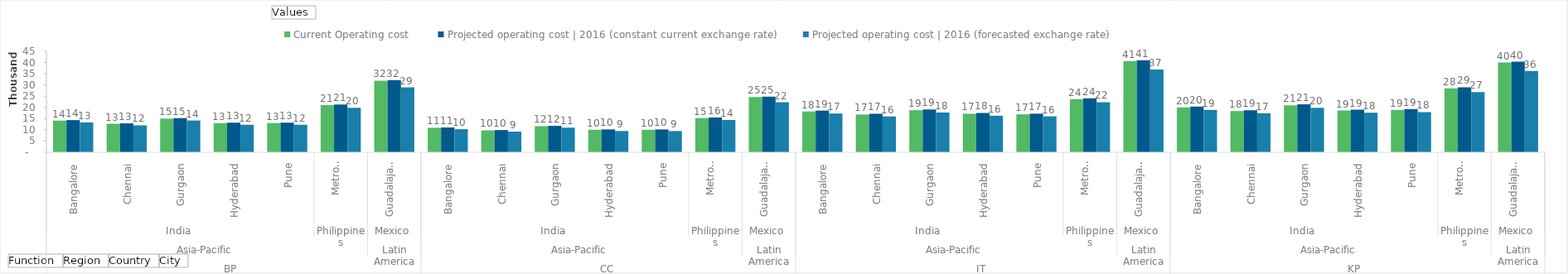
| Category | Current Operating cost  | Projected operating cost | 2016 (constant current exchange rate)  | Projected operating cost | 2016 (forecasted exchange rate)  |
|---|---|---|---|
| 0 | 14126.756 | 14353.324 | 13347.78 |
| 1 | 12715.147 | 12910.458 | 12005.996 |
| 2 | 15011.439 | 15240.785 | 14173.068 |
| 3 | 13005.254 | 13202.555 | 12277.63 |
| 4 | 13022.284 | 13217.05 | 12291.109 |
| 5 | 21032.375 | 21345.62 | 19799.761 |
| 6 | 31935.95 | 32190.768 | 28911.424 |
| 7 | 10912.829 | 11077.185 | 10301.156 |
| 8 | 9779.086 | 9920.169 | 9225.196 |
| 9 | 11648.937 | 11815.796 | 10988.022 |
| 10 | 10059.291 | 10202.236 | 9487.502 |
| 11 | 10052.06 | 10192.604 | 9478.546 |
| 12 | 15285.819 | 15530.951 | 14406.193 |
| 13 | 24631.232 | 24823.012 | 22294.238 |
| 14 | 18219.715 | 18593.261 | 17290.682 |
| 15 | 16846.181 | 17181.676 | 15977.987 |
| 16 | 18757.32 | 19087.975 | 17750.738 |
| 17 | 17193.9 | 17533.228 | 16304.911 |
| 18 | 16921.435 | 17233.229 | 16025.929 |
| 19 | 23715.726 | 24102.784 | 22357.25 |
| 20 | 40672.156 | 41068.48 | 36884.745 |
| 21 | 19981.252 | 20363.751 | 18937.137 |
| 22 | 18385.73 | 18743.463 | 17430.361 |
| 23 | 20947.011 | 21353.792 | 19857.819 |
| 24 | 18625.408 | 18984.036 | 17654.08 |
| 25 | 18872.617 | 19253.154 | 17904.344 |
| 26 | 28476.416 | 28978.055 | 26879.452 |
| 27 | 39985.608 | 40363.204 | 36251.317 |